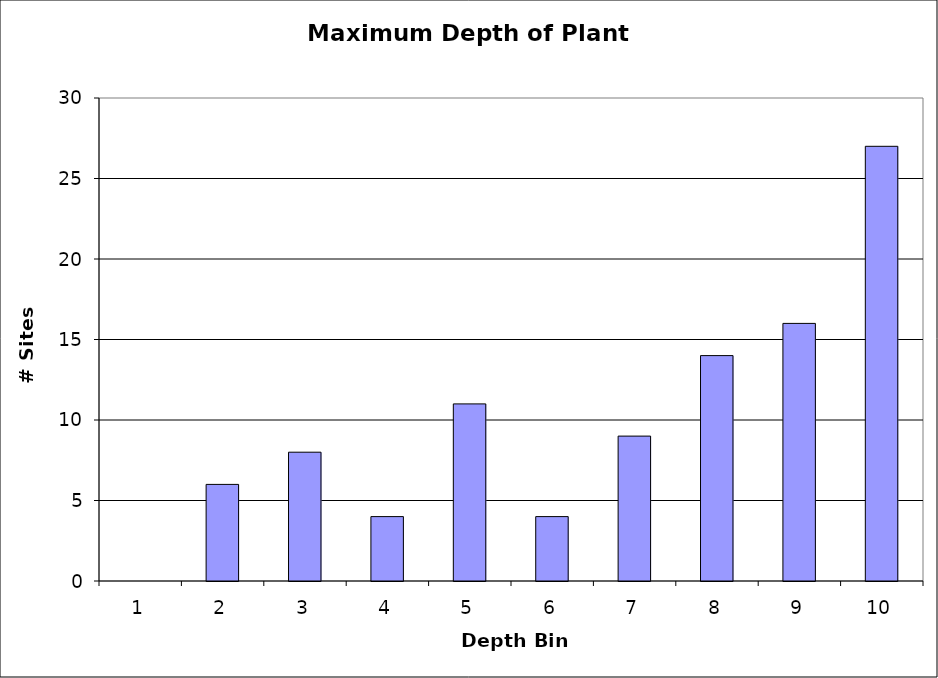
| Category | Series 0 |
|---|---|
| 1.0 | 0 |
| 2.0 | 6 |
| 3.0 | 8 |
| 4.0 | 4 |
| 5.0 | 11 |
| 6.0 | 4 |
| 7.0 | 9 |
| 8.0 | 14 |
| 9.0 | 16 |
| 10.0 | 27 |